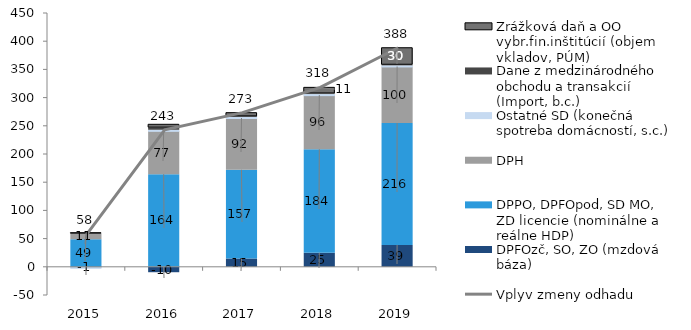
| Category | DPFOzč, SO, ZO (mzdová báza) | DPPO, DPFOpod, SD MO, ZD licencie (nominálne a reálne HDP) | DPH | Ostatné SD (konečná spotreba domácností, s.c.) | Dane z medzinárodného obchodu a transakcií (Import, b.c.) | Zrážková daň a OO vybr.fin.inštitúcií (objem vkladov, PÚM) |
|---|---|---|---|---|---|---|
| 2015.0 | -0.919 | 48.856 | 10.547 | -0.977 | 0.111 | 0.305 |
| 2016.0 | -9.62 | 164.269 | 76.773 | 1.937 | 3.784 | 5.882 |
| 2017.0 | 14.687 | 157.347 | 91.787 | 1.929 | 0.988 | 6.544 |
| 2018.0 | 24.833 | 183.649 | 95.88 | 1.928 | 1.039 | 10.803 |
| 2019.0 | 38.682 | 216.287 | 100.25 | 1.928 | 1.077 | 30.173 |